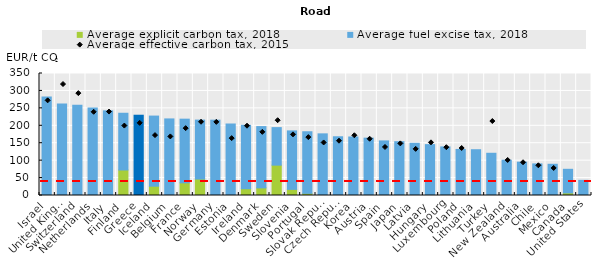
| Category | Average explicit carbon tax, 2018 | Average fuel excise tax, 2018 |
|---|---|---|
| Israel | 0 | 282.708 |
| United Kingdom | 0 | 262.386 |
| Switzerland | 0 | 258.598 |
| Netherlands | 0 | 250.78 |
| Italy | 0 | 242.876 |
| Finland | 73.191 | 162.752 |
| Greece | 0 | 230.279 |
| Iceland | 26.706 | 201.146 |
| Belgium | 0 | 219.702 |
| France | 36.294 | 182.696 |
| Norway | 47.225 | 169.107 |
| Germany | 0 | 216.077 |
| Estonia | 0 | 205.126 |
| Ireland | 19.504 | 181.857 |
| Denmark | 21.865 | 175.867 |
| Sweden | 87.08 | 107.704 |
| Slovenia | 17.605 | 167.743 |
| Portugal | 6.167 | 176.742 |
| Slovak Republic | 0 | 176.85 |
| Czech Republic | 0 | 168.478 |
| Korea | 0 | 167.85 |
| Austria | 0 | 164.549 |
| Spain | 0 | 156.596 |
| Japan | 2.395 | 151.941 |
| Latvia | 0 | 149.825 |
| Hungary | 0 | 145.955 |
| Luxembourg | 0 | 139.392 |
| Poland | 0 | 132.155 |
| Lithuania | 0 | 131.343 |
| Turkey | 0 | 121.135 |
| New Zealand | 0 | 101.267 |
| Australia | 0 | 95.672 |
| Chile | 0 | 90.604 |
| Mexico | 2.349 | 87.225 |
| Canada | 7.477 | 67.692 |
| United States | 0 | 43.451 |